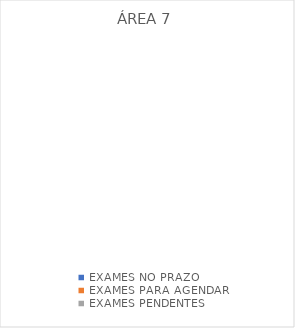
| Category | ÁREA 7 |
|---|---|
| EXAMES NO PRAZO | 0 |
| EXAMES PARA AGENDAR | 0 |
| EXAMES PENDENTES | 0 |